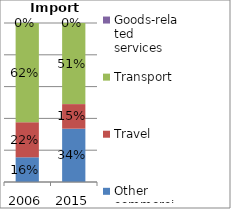
| Category | Other commercial services | Travel | Transport | Goods-related services |
|---|---|---|---|---|
| 2006.0 | 0.155 | 0.22 | 0.624 |  |
| 2015.0 | 0.335 | 0.155 | 0.51 |  |